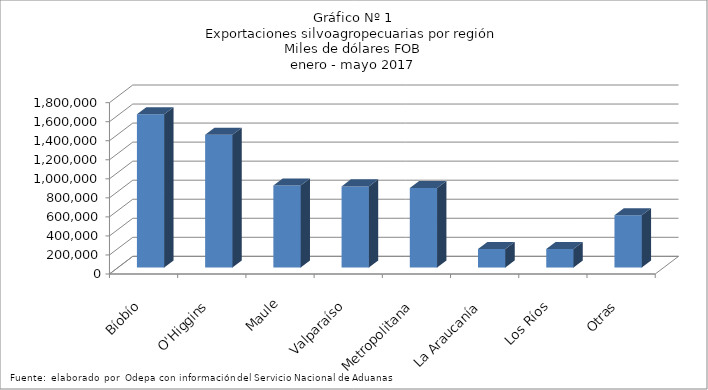
| Category | Series 0 |
|---|---|
| Bíobío | 1609385.905 |
| O'Higgins | 1393772.757 |
| Maule | 862087.369 |
| Valparaíso | 852126.438 |
| Metropolitana | 836134.603 |
| La Araucanía | 194522.981 |
| Los Ríos | 194472.893 |
| Otras | 549015.807 |